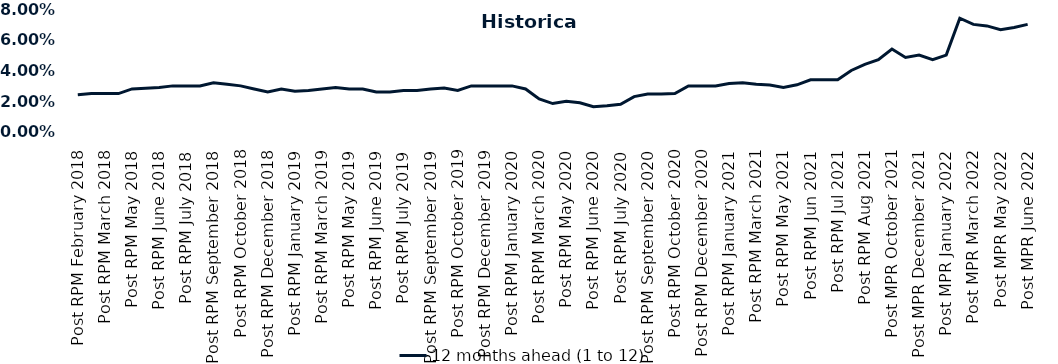
| Category | 12 months ahead (1 to 12)  |
|---|---|
| Post RPM February 2018 | 0.024 |
| Pre RPM March 2018 | 0.025 |
| Post RPM March 2018 | 0.025 |
| Pre RPM May 2018 | 0.025 |
| Post RPM May 2018 | 0.028 |
| Pre RPM June 2018 | 0.028 |
| Post RPM June 2018 | 0.029 |
| Pre RPM July 2018 | 0.03 |
| Post RPM July 2018 | 0.03 |
| Pre RPM September 2018 | 0.03 |
| Post RPM September 2018 | 0.032 |
| Pre RPM October 2018 | 0.031 |
| Post RPM October 2018 | 0.03 |
| Pre RPM December 2018 | 0.028 |
| Post RPM December 2018 | 0.026 |
| Pre RPM January 2019 | 0.028 |
| Post RPM January 2019 | 0.026 |
| Pre RPM March 2019 | 0.027 |
| Post RPM March 2019 | 0.028 |
| Pre RPM May 2019 | 0.029 |
| Post RPM May 2019 | 0.028 |
| Pre RPM June 2019 | 0.028 |
| Post RPM June 2019 | 0.026 |
| Pre RPM July 2019 | 0.026 |
| Post RPM July 2019 | 0.027 |
| Pre RPM September 2019 | 0.027 |
| Post RPM September 2019 | 0.028 |
| Pre RPM October 2019 | 0.029 |
| Post RPM October 2019 | 0.027 |
| Pre RPM December 2019 | 0.03 |
| Post RPM December 2019 | 0.03 |
| Pre RPM January 2020 | 0.03 |
| Post RPM January 2020 | 0.03 |
| Pre RPM March 2020 | 0.028 |
| Post RPM March 2020 | 0.022 |
| Pre RPM May 2020 | 0.018 |
| Post RPM May 2020 | 0.02 |
| Pre RPM June 2020 | 0.019 |
| Post RPM June 2020 | 0.016 |
| Pre RPM July 2020 | 0.017 |
| Post RPM July 2020 | 0.018 |
| Pre RPM September 2020 | 0.023 |
| Post RPM September 2020 | 0.025 |
| Pre RPM October 2020 | 0.025 |
| Post RPM October 2020 | 0.025 |
| Pre RPM December 2020 | 0.03 |
|  Post RPM December 2020 | 0.03 |
| Pre RPM January 2021 | 0.03 |
| Post RPM January 2021 | 0.032 |
|  Pre RPM March 2021 | 0.032 |
|  Post RPM March 2021 | 0.031 |
|  Pre RPM May 2021 | 0.03 |
|  Post RPM May 2021 | 0.029 |
|  Pre RPM Jun 2021 | 0.031 |
|   Post RPM Jun 2021 | 0.034 |
| Pre RPM Jul 2021 | 0.034 |
|  Post RPM Jul 2021 | 0.034 |
| Pre RPM Aug 2021 | 0.04 |
|  Post RPM Aug 2021 | 0.044 |
| Pre MPR October 2021 | 0.047 |
| Post MPR October 2021 | 0.054 |
| Pre MPR December 2021 | 0.048 |
| Post MPR December 2021 | 0.05 |
| Pre MPR January 2022 | 0.047 |
| Post MPR January 2022 | 0.05 |
| Pre MPR March 2022 | 0.074 |
| Post MPR March 2022 | 0.07 |
| Pre MPR May 2022 | 0.069 |
| Post MPR May 2022 | 0.066 |
| Pre MPR June 2022 | 0.068 |
| Post MPR June 2022 | 0.07 |